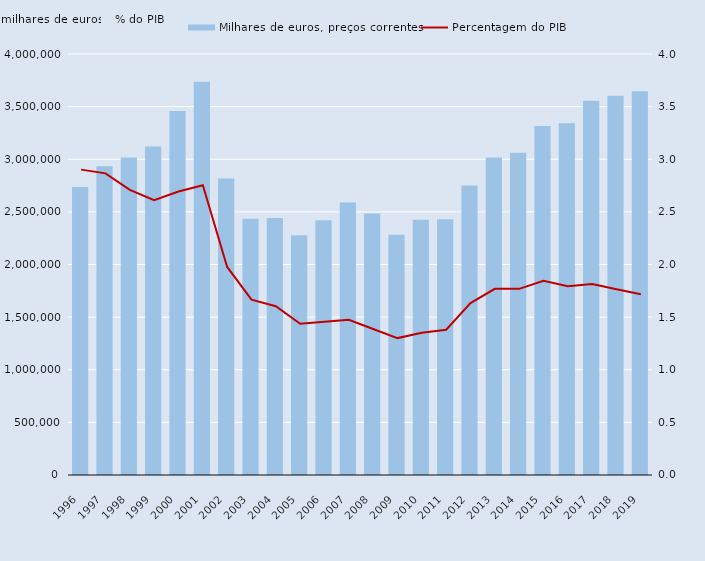
| Category | Milhares de euros, preços correntes |
|---|---|
| 1996.0 | 2737490 |
| 1997.0 | 2932550 |
| 1998.0 | 3016290 |
| 1999.0 | 3121680 |
| 2000.0 | 3458120 |
| 2001.0 | 3736820 |
| 2002.0 | 2817880 |
| 2003.0 | 2433780 |
| 2004.0 | 2442160 |
| 2005.0 | 2277250 |
| 2006.0 | 2420270 |
| 2007.0 | 2588420 |
| 2008.0 | 2484680 |
| 2009.0 | 2281870 |
| 2010.0 | 2425900 |
| 2011.0 | 2430490 |
| 2012.0 | 2749460 |
| 2013.0 | 3015780 |
| 2014.0 | 3060710 |
| 2015.0 | 3315620 |
| 2016.0 | 3343200 |
| 2017.0 | 3554750 |
| 2018.0 | 3604010 |
| 2019.0 | 3645230 |